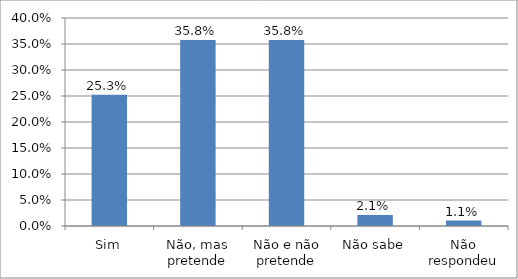
| Category | Series 0 |
|---|---|
| Sim | 0.253 |
| Não, mas pretende | 0.358 |
| Não e não pretende | 0.358 |
| Não sabe | 0.021 |
| Não respondeu | 0.011 |